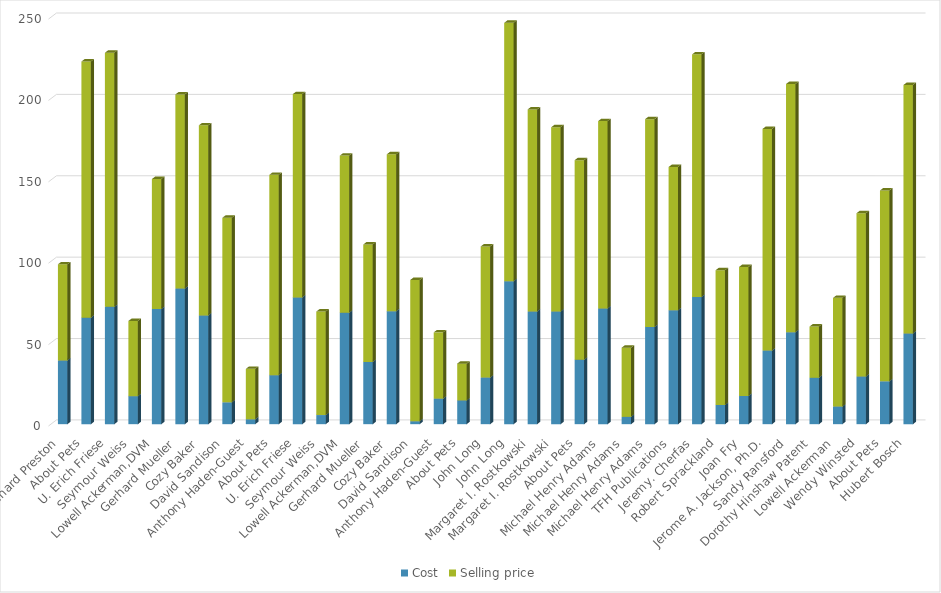
| Category | Cost | Selling price |
|---|---|---|
| Richard Preston | 39.1 | 59.1 |
| About Pets | 65.4 | 157.4 |
| U. Erich Friese | 72.1 | 156.1 |
| Seymour Weiss | 17.2 | 46.2 |
| Lowell Ackerman,DVM | 70.8 | 79.8 |
| Gerhard Mueller | 83.3 | 119.3 |
| Cozy Baker | 66.8 | 116.8 |
| David Sandison | 13.4 | 113.4 |
| Anthony Haden-Guest | 3 | 31 |
| About Pets | 30.1 | 123.1 |
| U. Erich Friese | 77.9 | 124.9 |
| Seymour Weiss | 5.6 | 63.6 |
| Lowell Ackerman,DVM | 68.5 | 96.5 |
| Gerhard Mueller | 38.2 | 72.2 |
| Cozy Baker | 69.4 | 96.4 |
| David Sandison | 1.8 | 86.8 |
| Anthony Haden-Guest | 15.7 | 40.7 |
| About Pets | 14.6 | 22.6 |
| John Long | 28.6 | 80.6 |
| John Long | 87.8 | 158.8 |
| Margaret I. Rostkowski | 69.2 | 124.2 |
| Margaret I. Rostkowski | 69.2 | 113.2 |
| About Pets | 39.6 | 122.6 |
| Michael Henry Adams | 71.1 | 115.1 |
| Michael Henry Adams | 4.5 | 42.5 |
| Michael Henry Adams | 59.7 | 127.7 |
| TFH Publications | 70 | 88 |
| Jeremy. Cherfas | 78.1 | 149.1 |
| Robert Sprackland | 11.8 | 82.8 |
| Joan Fry | 17.3 | 79.3 |
| Jerome A. Jackson, Ph.D. | 45.2 | 136.2 |
| Sandy Ransford | 56.5 | 152.5 |
| Dorothy Hinshaw Patent | 28.5 | 31.5 |
| Lowell Ackerman | 10.8 | 66.8 |
| Wendy Winsted | 29.3 | 100.3 |
| About Pets | 26.3 | 117.3 |
| Hubert Bosch | 55.7 | 152.7 |